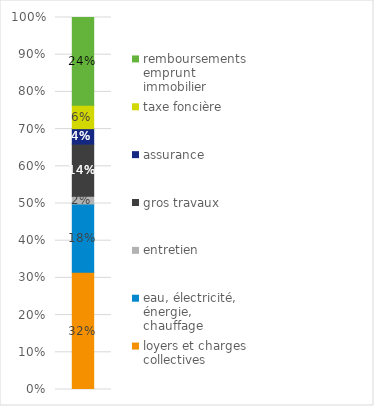
| Category | loyers et charges collectives | eau, électricité, énergie, chauffage | entretien | gros travaux | assurance | taxe foncière | remboursements emprunt immobilier |
|---|---|---|---|---|---|---|---|
| 0 | 0.315 | 0.183 | 0.021 | 0.14 | 0.042 | 0.063 | 0.236 |